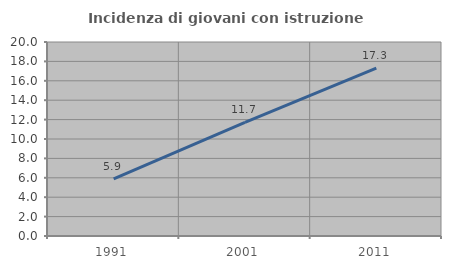
| Category | Incidenza di giovani con istruzione universitaria |
|---|---|
| 1991.0 | 5.893 |
| 2001.0 | 11.715 |
| 2011.0 | 17.299 |